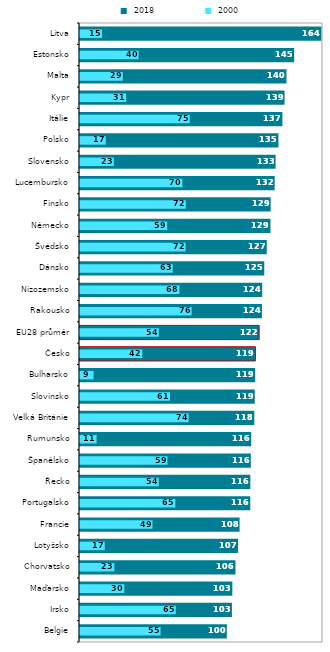
| Category |  2018 |
|---|---|
| Belgie | 99.697 |
| Irsko | 103.171 |
| Maďarsko | 103.445 |
| Chorvatsko | 105.583 |
| Lotyšsko | 107.349 |
| Francie | 108.357 |
| Portugalsko | 115.633 |
| Řecko | 115.667 |
| Španělsko | 115.994 |
| Rumunsko | 116.246 |
| Velká Británie | 118.365 |
| Slovinsko | 118.674 |
| Bulharsko | 118.94 |
| Česko | 119.114 |
| EU28 průměr | 121.649 |
| Rakousko | 123.535 |
| Nizozemsko | 123.731 |
| Dánsko | 125.119 |
| Švédsko | 126.831 |
| Německo | 129.324 |
| Finsko | 129.469 |
| Lucembursko | 132.165 |
| Slovensko | 132.802 |
| Polsko | 134.748 |
| Itálie | 137.467 |
| Kypr | 138.9 |
| Malta | 140.204 |
| Estonsko | 145.438 |
| Litva | 163.87 |